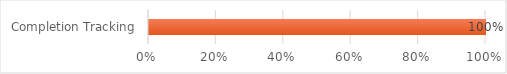
| Category | Series 0 |
|---|---|
| Completion Tracking | 1 |